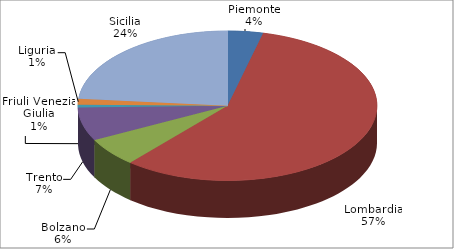
| Category | Series 0 |
|---|---|
| Piemonte | 362 |
| Lombardia | 5438 |
| Bolzano | 585 |
| Trento | 681 |
| Friuli Venezia Giulia | 59 |
| Liguria | 118 |
| Sicilia | 2228 |